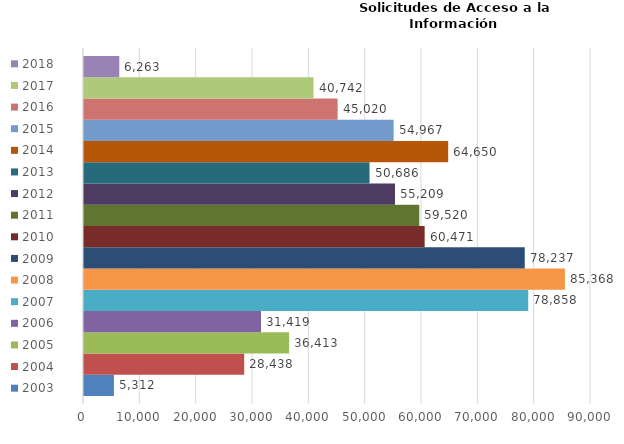
| Category | 2003 | 2004 | 2005 | 2006 | 2007 | 2008 | 2009 | 2010 | 2011 | 2012 | 2013 | 2014 | 2015 | 2016 | 2017 | 2018 |
|---|---|---|---|---|---|---|---|---|---|---|---|---|---|---|---|---|
| 0 | 5312 | 28438 | 36413 | 31419 | 78858 | 85368 | 78237 | 60471 | 59520 | 55209 | 50686 | 64650 | 54967 | 45020 | 40742 | 6263 |